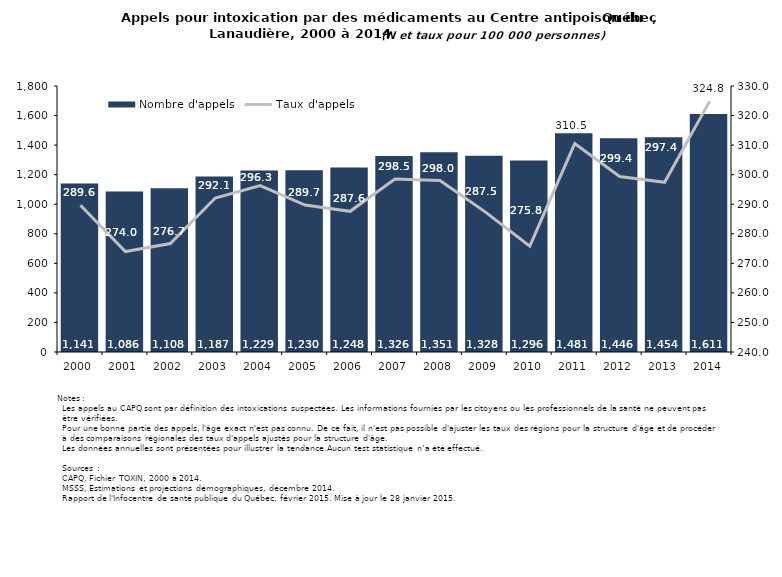
| Category | Nombre d'appels |
|---|---|
| 2000.0 | 1141 |
| 2001.0 | 1086 |
| 2002.0 | 1108 |
| 2003.0 | 1187 |
| 2004.0 | 1229 |
| 2005.0 | 1230 |
| 2006.0 | 1248 |
| 2007.0 | 1326 |
| 2008.0 | 1351 |
| 2009.0 | 1328 |
| 2010.0 | 1296 |
| 2011.0 | 1481 |
| 2012.0 | 1446 |
| 2013.0 | 1454 |
| 2014.0 | 1611 |